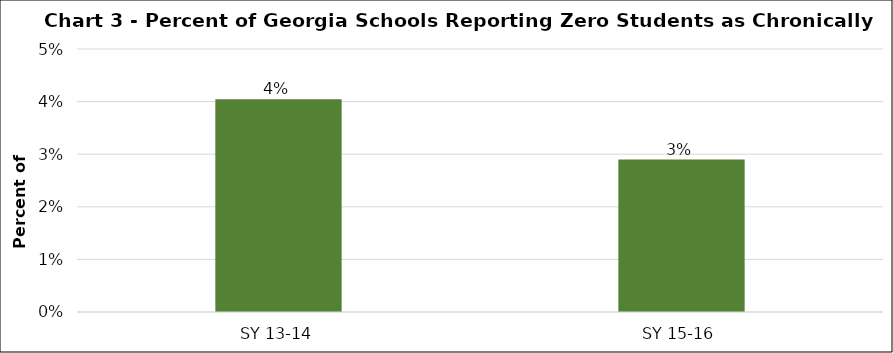
| Category | Series 0 |
|---|---|
| SY 13-14 | 0.04 |
| SY 15-16 | 0.029 |